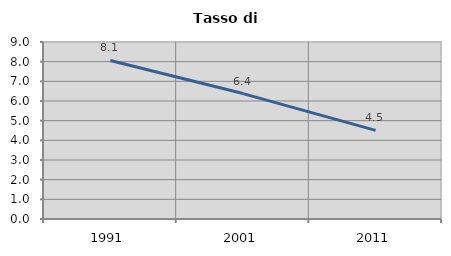
| Category | Tasso di disoccupazione   |
|---|---|
| 1991.0 | 8.06 |
| 2001.0 | 6.378 |
| 2011.0 | 4.506 |